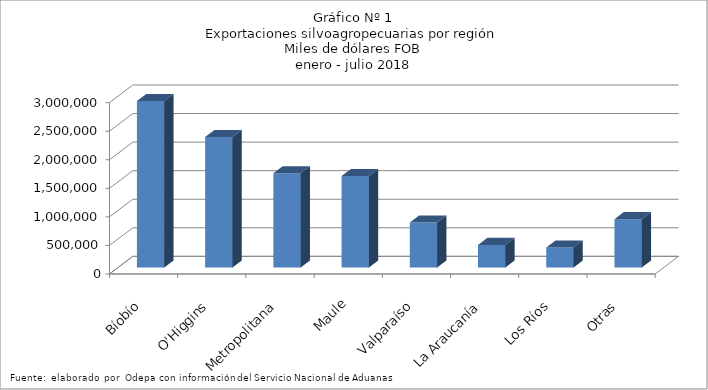
| Category | Series 0 |
|---|---|
| Bíobío | 2915095.299 |
| O'Higgins | 2283708.956 |
| Metropolitana | 1649288.794 |
| Maule | 1602938.502 |
| Valparaíso | 786386.933 |
| La Araucanía | 395971.971 |
| Los Ríos | 351454.292 |
| Otras | 846925.928 |